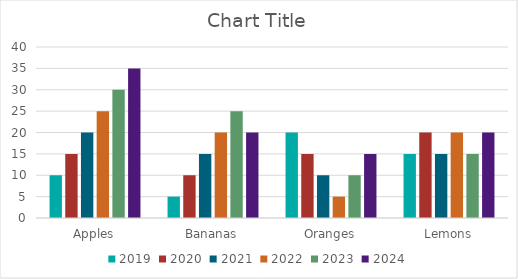
| Category | 2019 | 2020 | 2021 | 2022 | 2023 | 2024 |
|---|---|---|---|---|---|---|
| Apples | 10 | 15 | 20 | 25 | 30 | 35 |
| Bananas | 5 | 10 | 15 | 20 | 25 | 20 |
| Oranges | 20 | 15 | 10 | 5 | 10 | 15 |
| Lemons | 15 | 20 | 15 | 20 | 15 | 20 |